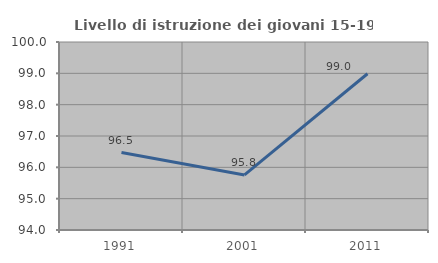
| Category | Livello di istruzione dei giovani 15-19 anni |
|---|---|
| 1991.0 | 96.473 |
| 2001.0 | 95.758 |
| 2011.0 | 98.987 |